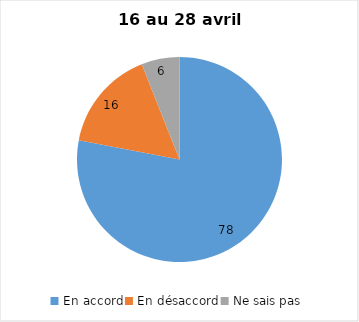
| Category | Series 0 |
|---|---|
| En accord | 78 |
| En désaccord | 16 |
| Ne sais pas | 6 |